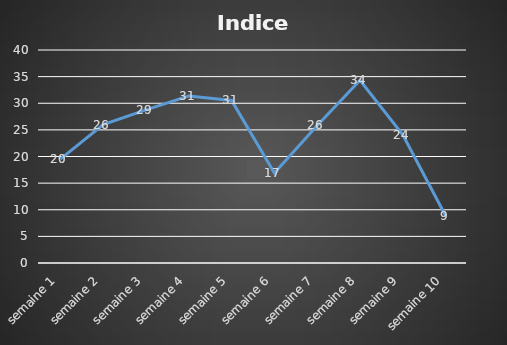
| Category | Indice eff |
|---|---|
| semaine 1 | 19.518 |
| semaine 2 | 25.988 |
| semaine 3 | 28.741 |
| semaine 4 | 31.374 |
| semaine 5 | 30.534 |
| semaine 6 | 16.89 |
| semaine 7 | 25.832 |
| semaine 8 | 34.326 |
| semaine 9 | 24.075 |
| semaine 10 | 8.881 |